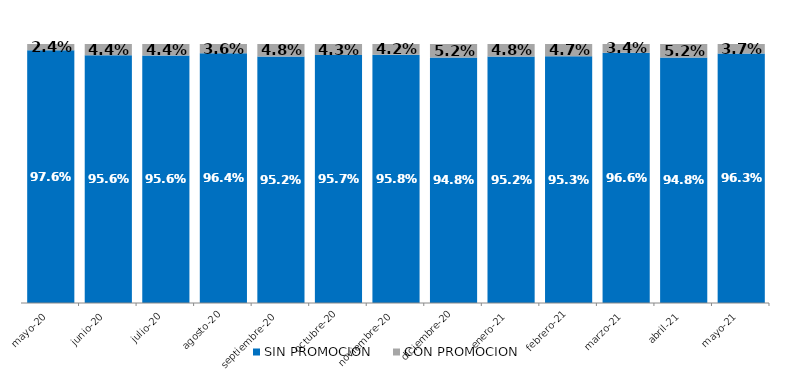
| Category | SIN PROMOCION   | CON PROMOCION   |
|---|---|---|
| 2020-05-01 | 0.976 | 0.024 |
| 2020-06-01 | 0.956 | 0.044 |
| 2020-07-01 | 0.956 | 0.044 |
| 2020-08-01 | 0.964 | 0.036 |
| 2020-09-01 | 0.952 | 0.048 |
| 2020-10-01 | 0.957 | 0.043 |
| 2020-11-01 | 0.958 | 0.042 |
| 2020-12-01 | 0.948 | 0.052 |
| 2021-01-01 | 0.952 | 0.048 |
| 2021-02-01 | 0.953 | 0.047 |
| 2021-03-01 | 0.966 | 0.034 |
| 2021-04-01 | 0.948 | 0.052 |
| 2021-05-01 | 0.963 | 0.037 |